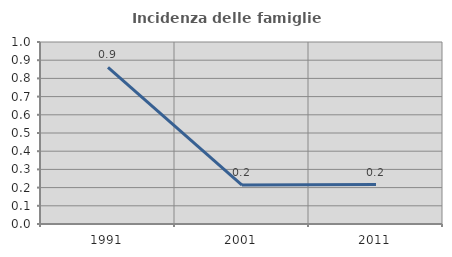
| Category | Incidenza delle famiglie numerose |
|---|---|
| 1991.0 | 0.86 |
| 2001.0 | 0.214 |
| 2011.0 | 0.217 |